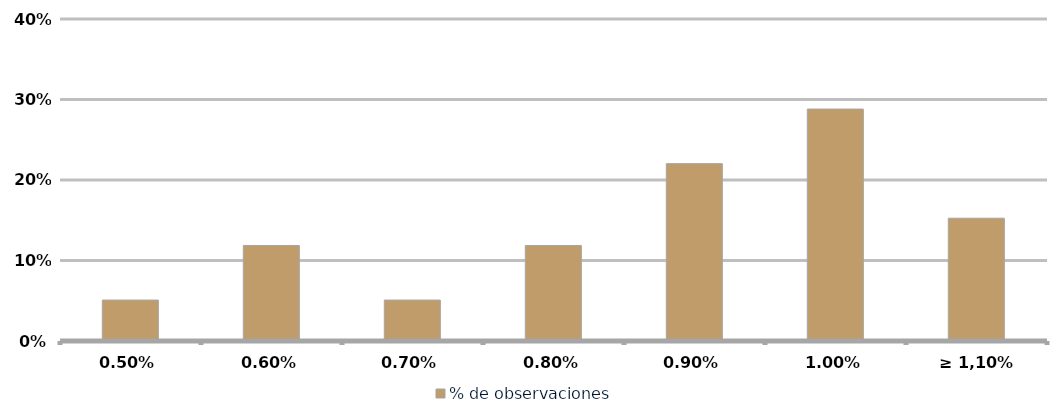
| Category | % de observaciones  |
|---|---|
| 0,50% | 0.051 |
| 0,60% | 0.119 |
| 0,70% | 0.051 |
| 0,80% | 0.119 |
| 0,90% | 0.22 |
| 1,00% | 0.288 |
| ≥ 1,10% | 0.153 |